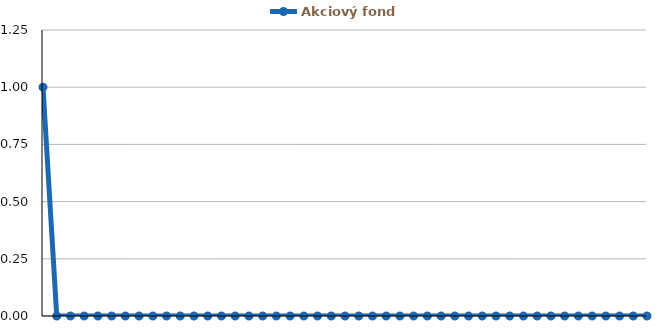
| Category | Akciový fond |
|---|---|
| 0 | 1 |
| 1 | 0 |
| 2 | 0 |
| 3 | 0 |
| 4 | 0 |
| 5 | 0 |
| 6 | 0 |
| 7 | 0 |
| 8 | 0 |
| 9 | 0 |
| 10 | 0 |
| 11 | 0 |
| 12 | 0 |
| 13 | 0 |
| 14 | 0 |
| 15 | 0 |
| 16 | 0 |
| 17 | 0 |
| 18 | 0 |
| 19 | 0 |
| 20 | 0 |
| 21 | 0 |
| 22 | 0 |
| 23 | 0 |
| 24 | 0 |
| 25 | 0 |
| 26 | 0 |
| 27 | 0 |
| 28 | 0 |
| 29 | 0 |
| 30 | 0 |
| 31 | 0 |
| 32 | 0 |
| 33 | 0 |
| 34 | 0 |
| 35 | 0 |
| 36 | 0 |
| 37 | 0 |
| 38 | 0 |
| 39 | 0 |
| 40 | 0 |
| 41 | 0 |
| 42 | 0 |
| 43 | 0 |
| 44 | 0 |